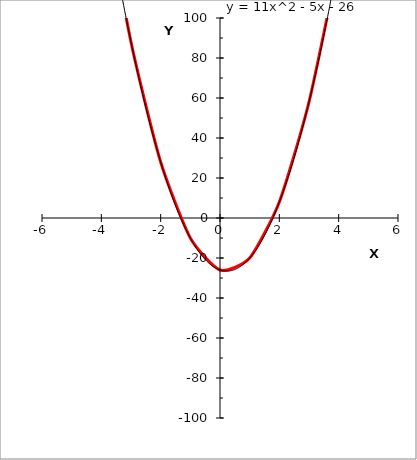
| Category | y |
|---|---|
| -5.0 | 274 |
| -4.0 | 170 |
| -3.0 | 88 |
| -2.0 | 28 |
| -1.0 | -10 |
| 0.0 | -26 |
| 1.0 | -20 |
| 2.0 | 8 |
| 3.0 | 58 |
| 4.0 | 130 |
| 5.0 | 224 |